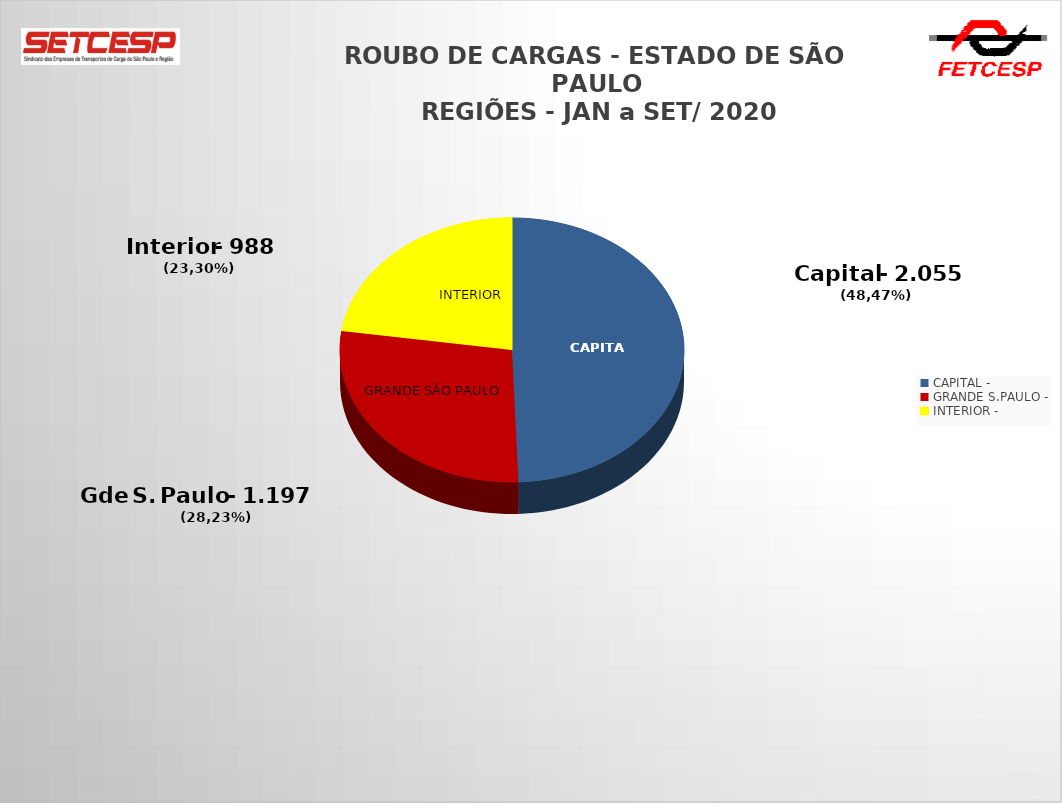
| Category | Series 0 | Series 1 |
|---|---|---|
| CAPITAL -  | 1455 | 0.494 |
| GRANDE S.PAULO -  | 821 | 0.279 |
| INTERIOR - | 669 | 0.227 |